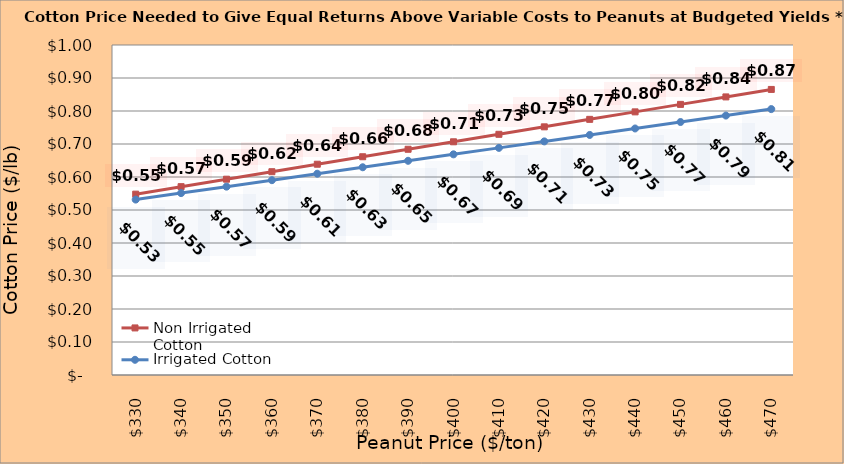
| Category | Non Irrigated Cotton | Irrigated Cotton |
|---|---|---|
| 330.0 | 0.548 | 0.532 |
| 340.0 | 0.571 | 0.551 |
| 350.0 | 0.593 | 0.571 |
| 360.0 | 0.616 | 0.59 |
| 370.0 | 0.639 | 0.61 |
| 380.0 | 0.661 | 0.63 |
| 390.0 | 0.684 | 0.649 |
| 400.0 | 0.707 | 0.669 |
| 410.0 | 0.729 | 0.688 |
| 420.0 | 0.752 | 0.708 |
| 430.0 | 0.775 | 0.727 |
| 440.0 | 0.797 | 0.747 |
| 450.0 | 0.82 | 0.767 |
| 460.0 | 0.843 | 0.786 |
| 470.0 | 0.865 | 0.806 |